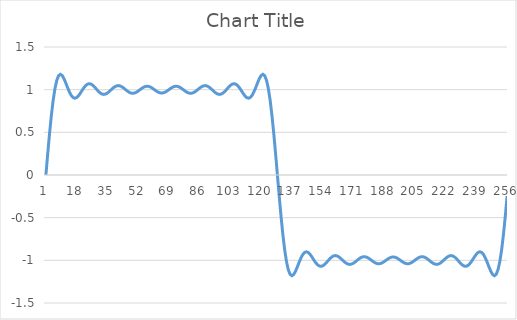
| Category | Series 0 |
|---|---|
| 0 | 0 |
| 1 | 0.248 |
| 2 | 0.483 |
| 3 | 0.695 |
| 4 | 0.873 |
| 5 | 1.012 |
| 6 | 1.109 |
| 7 | 1.163 |
| 8 | 1.18 |
| 9 | 1.166 |
| 10 | 1.129 |
| 11 | 1.078 |
| 12 | 1.023 |
| 13 | 0.973 |
| 14 | 0.933 |
| 15 | 0.908 |
| 16 | 0.9 |
| 17 | 0.908 |
| 18 | 0.928 |
| 19 | 0.958 |
| 20 | 0.991 |
| 21 | 1.022 |
| 22 | 1.048 |
| 23 | 1.065 |
| 24 | 1.07 |
| 25 | 1.065 |
| 26 | 1.05 |
| 27 | 1.029 |
| 28 | 1.005 |
| 29 | 0.981 |
| 30 | 0.961 |
| 31 | 0.949 |
| 32 | 0.944 |
| 33 | 0.949 |
| 34 | 0.96 |
| 35 | 0.978 |
| 36 | 0.997 |
| 37 | 1.017 |
| 38 | 1.033 |
| 39 | 1.044 |
| 40 | 1.047 |
| 41 | 1.044 |
| 42 | 1.034 |
| 43 | 1.019 |
| 44 | 1.001 |
| 45 | 0.984 |
| 46 | 0.97 |
| 47 | 0.96 |
| 48 | 0.957 |
| 49 | 0.96 |
| 50 | 0.97 |
| 51 | 0.983 |
| 52 | 0.999 |
| 53 | 1.015 |
| 54 | 1.028 |
| 55 | 1.037 |
| 56 | 1.04 |
| 57 | 1.037 |
| 58 | 1.029 |
| 59 | 1.016 |
| 60 | 1 |
| 61 | 0.985 |
| 62 | 0.972 |
| 63 | 0.963 |
| 64 | 0.96 |
| 65 | 0.963 |
| 66 | 0.972 |
| 67 | 0.985 |
| 68 | 1 |
| 69 | 1.016 |
| 70 | 1.029 |
| 71 | 1.037 |
| 72 | 1.04 |
| 73 | 1.037 |
| 74 | 1.028 |
| 75 | 1.015 |
| 76 | 0.999 |
| 77 | 0.983 |
| 78 | 0.97 |
| 79 | 0.96 |
| 80 | 0.957 |
| 81 | 0.96 |
| 82 | 0.97 |
| 83 | 0.984 |
| 84 | 1.001 |
| 85 | 1.019 |
| 86 | 1.034 |
| 87 | 1.044 |
| 88 | 1.047 |
| 89 | 1.044 |
| 90 | 1.033 |
| 91 | 1.017 |
| 92 | 0.997 |
| 93 | 0.978 |
| 94 | 0.96 |
| 95 | 0.949 |
| 96 | 0.944 |
| 97 | 0.949 |
| 98 | 0.961 |
| 99 | 0.981 |
| 100 | 1.005 |
| 101 | 1.029 |
| 102 | 1.05 |
| 103 | 1.065 |
| 104 | 1.07 |
| 105 | 1.065 |
| 106 | 1.048 |
| 107 | 1.022 |
| 108 | 0.991 |
| 109 | 0.958 |
| 110 | 0.928 |
| 111 | 0.908 |
| 112 | 0.9 |
| 113 | 0.908 |
| 114 | 0.933 |
| 115 | 0.973 |
| 116 | 1.023 |
| 117 | 1.078 |
| 118 | 1.129 |
| 119 | 1.166 |
| 120 | 1.18 |
| 121 | 1.163 |
| 122 | 1.109 |
| 123 | 1.012 |
| 124 | 0.873 |
| 125 | 0.695 |
| 126 | 0.483 |
| 127 | 0.248 |
| 128 | 0 |
| 129 | -0.248 |
| 130 | -0.483 |
| 131 | -0.695 |
| 132 | -0.873 |
| 133 | -1.012 |
| 134 | -1.109 |
| 135 | -1.163 |
| 136 | -1.18 |
| 137 | -1.166 |
| 138 | -1.129 |
| 139 | -1.078 |
| 140 | -1.023 |
| 141 | -0.973 |
| 142 | -0.933 |
| 143 | -0.908 |
| 144 | -0.9 |
| 145 | -0.908 |
| 146 | -0.928 |
| 147 | -0.958 |
| 148 | -0.991 |
| 149 | -1.022 |
| 150 | -1.048 |
| 151 | -1.065 |
| 152 | -1.07 |
| 153 | -1.065 |
| 154 | -1.05 |
| 155 | -1.029 |
| 156 | -1.005 |
| 157 | -0.981 |
| 158 | -0.961 |
| 159 | -0.949 |
| 160 | -0.944 |
| 161 | -0.949 |
| 162 | -0.96 |
| 163 | -0.978 |
| 164 | -0.997 |
| 165 | -1.017 |
| 166 | -1.033 |
| 167 | -1.044 |
| 168 | -1.047 |
| 169 | -1.044 |
| 170 | -1.034 |
| 171 | -1.019 |
| 172 | -1.001 |
| 173 | -0.984 |
| 174 | -0.97 |
| 175 | -0.96 |
| 176 | -0.957 |
| 177 | -0.96 |
| 178 | -0.97 |
| 179 | -0.983 |
| 180 | -0.999 |
| 181 | -1.015 |
| 182 | -1.028 |
| 183 | -1.037 |
| 184 | -1.04 |
| 185 | -1.037 |
| 186 | -1.029 |
| 187 | -1.016 |
| 188 | -1 |
| 189 | -0.985 |
| 190 | -0.972 |
| 191 | -0.963 |
| 192 | -0.96 |
| 193 | -0.963 |
| 194 | -0.972 |
| 195 | -0.985 |
| 196 | -1 |
| 197 | -1.016 |
| 198 | -1.029 |
| 199 | -1.037 |
| 200 | -1.04 |
| 201 | -1.037 |
| 202 | -1.028 |
| 203 | -1.015 |
| 204 | -0.999 |
| 205 | -0.983 |
| 206 | -0.97 |
| 207 | -0.96 |
| 208 | -0.957 |
| 209 | -0.96 |
| 210 | -0.97 |
| 211 | -0.984 |
| 212 | -1.001 |
| 213 | -1.019 |
| 214 | -1.034 |
| 215 | -1.044 |
| 216 | -1.047 |
| 217 | -1.044 |
| 218 | -1.033 |
| 219 | -1.017 |
| 220 | -0.997 |
| 221 | -0.978 |
| 222 | -0.96 |
| 223 | -0.949 |
| 224 | -0.944 |
| 225 | -0.949 |
| 226 | -0.961 |
| 227 | -0.981 |
| 228 | -1.005 |
| 229 | -1.029 |
| 230 | -1.05 |
| 231 | -1.065 |
| 232 | -1.07 |
| 233 | -1.065 |
| 234 | -1.048 |
| 235 | -1.022 |
| 236 | -0.991 |
| 237 | -0.958 |
| 238 | -0.928 |
| 239 | -0.908 |
| 240 | -0.9 |
| 241 | -0.908 |
| 242 | -0.933 |
| 243 | -0.973 |
| 244 | -1.023 |
| 245 | -1.078 |
| 246 | -1.129 |
| 247 | -1.166 |
| 248 | -1.18 |
| 249 | -1.163 |
| 250 | -1.109 |
| 251 | -1.012 |
| 252 | -0.873 |
| 253 | -0.695 |
| 254 | -0.483 |
| 255 | -0.248 |